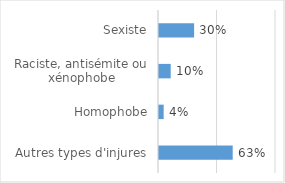
| Category | Series 0 |
|---|---|
| Autres types d'injures | 0.63 |
| Homophobe | 0.04 |
| Raciste, antisémite ou xénophobe | 0.1 |
| Sexiste | 0.3 |